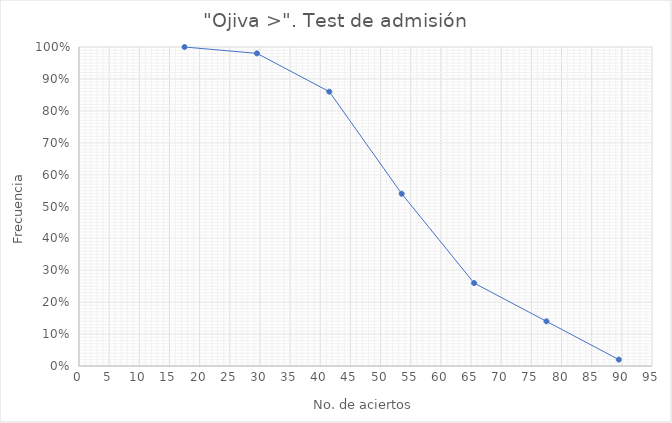
| Category | Series 0 |
|---|---|
| 17.5 | 1 |
| 29.5 | 0.98 |
| 41.5 | 0.86 |
| 53.5 | 0.54 |
| 65.5 | 0.26 |
| 77.5 | 0.14 |
| 89.5 | 0.02 |